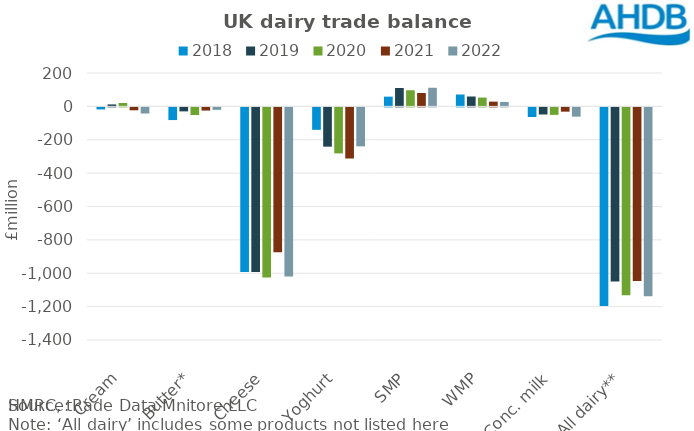
| Category | 2018 | 2019 | 2020 | 2021 | 2022 |
|---|---|---|---|---|---|
| Cream | -12.317 | 11.746 | 20.081 | -17.496 | -36.668 |
| Butter* | -76.104 | -23.957 | -45.557 | -19.078 | -14.933 |
| Cheese | -985.96 | -986.809 | -1019.514 | -867.96 | -1013.202 |
| Yoghurt | -134.572 | -235.484 | -275.642 | -306.473 | -233.678 |
| SMP | 58.245 | 110.299 | 96.478 | 80.26 | 111.479 |
| WMP | 71.06 | 59.11 | 52.611 | 28.413 | 26.409 |
| Conc. milk | -57.685 | -42.629 | -44.857 | -25.637 | -55.55 |
| All dairy** | -1190.734 | -1043.784 | -1126.415 | -1040.27 | -1131.402 |